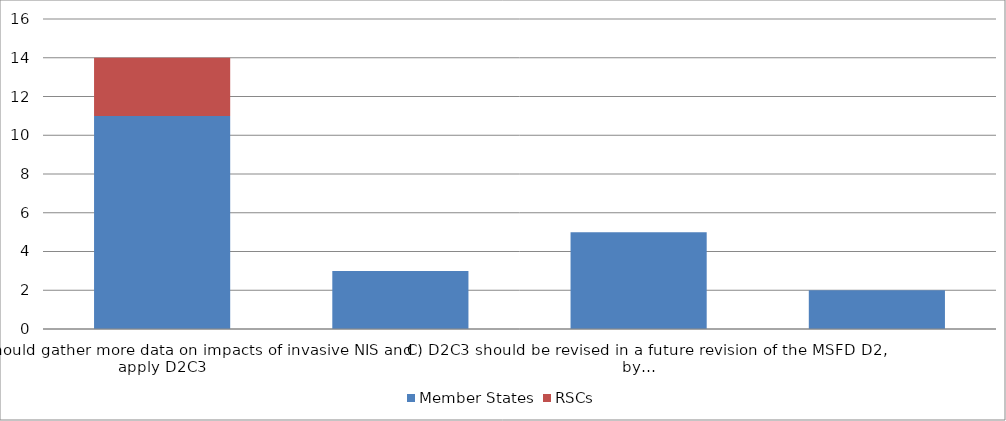
| Category | Member States | RSCs |
|---|---|---|
| A) MSs should gather more data on impacts of invasive NIS and apply D2C3  | 11 | 3 |
| B) D2C3 should be neglected; focus exclusively on prevention of new NIS introductions | 3 | 0 |
| C) D2C3 should be revised in a future revision of the MSFD D2, by… | 5 | 0 |
| D) other  | 2 | 0 |